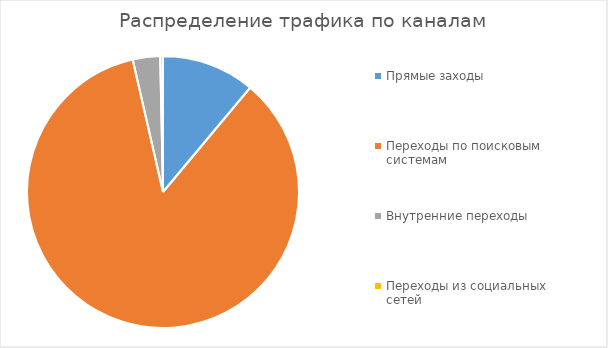
| Category | Series 0 |
|---|---|
| Прямые заходы | 34 |
| Переходы по поисковым системам | 262 |
| Внутренние переходы | 10 |
| Переходы из социальных сетей | 1 |